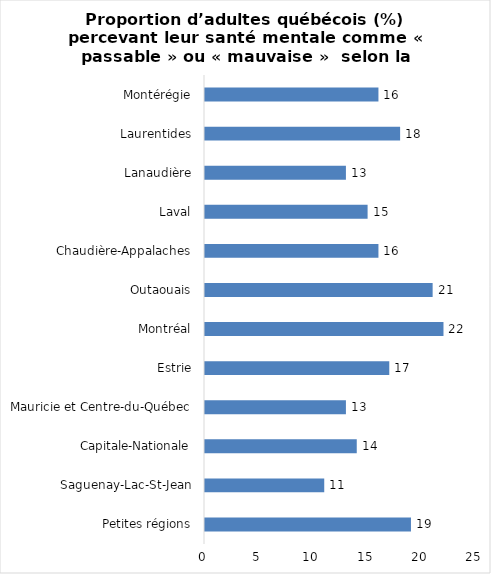
| Category | Series 0 |
|---|---|
| Petites régions | 19 |
| Saguenay-Lac-St-Jean | 11 |
| Capitale-Nationale | 14 |
| Mauricie et Centre-du-Québec | 13 |
| Estrie | 17 |
| Montréal | 22 |
| Outaouais | 21 |
| Chaudière-Appalaches | 16 |
| Laval | 15 |
| Lanaudière | 13 |
| Laurentides | 18 |
| Montérégie | 16 |